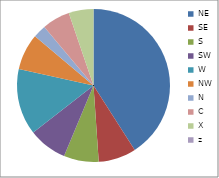
| Category | Series 0 |
|---|---|
| NE | 0.493 |
| SE | 0.096 |
| S | 0.089 |
| SW | 0.098 |
| W | 0.169 |
| NW | 0.092 |
| N | 0.033 |
| C | -0.071 |
| X | 0.063 |
| z | 0 |